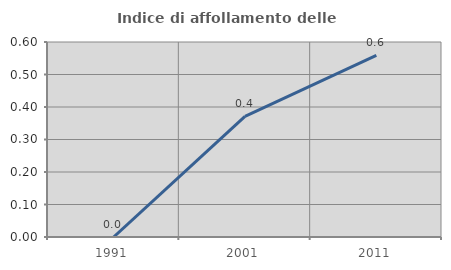
| Category | Indice di affollamento delle abitazioni  |
|---|---|
| 1991.0 | 0 |
| 2001.0 | 0.371 |
| 2011.0 | 0.559 |